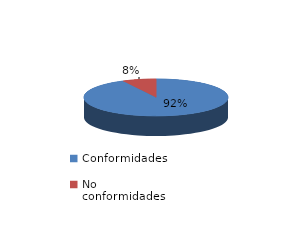
| Category | Series 0 |
|---|---|
| Conformidades | 196 |
| No conformidades | 16 |